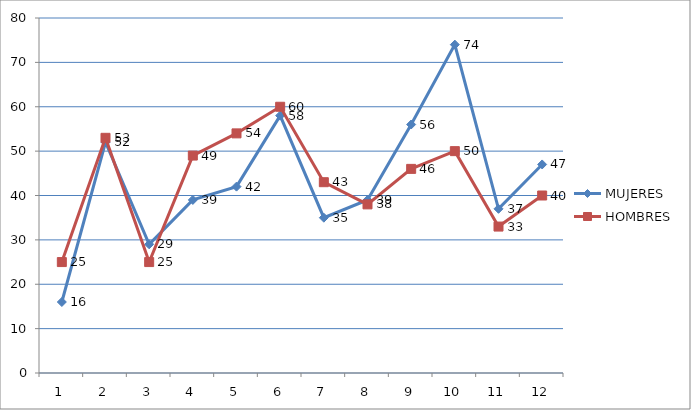
| Category | MUJERES | HOMBRES |
|---|---|---|
| 0 | 16 | 25 |
| 1 | 52 | 53 |
| 2 | 29 | 25 |
| 3 | 39 | 49 |
| 4 | 42 | 54 |
| 5 | 58 | 60 |
| 6 | 35 | 43 |
| 7 | 39 | 38 |
| 8 | 56 | 46 |
| 9 | 74 | 50 |
| 10 | 37 | 33 |
| 11 | 47 | 40 |